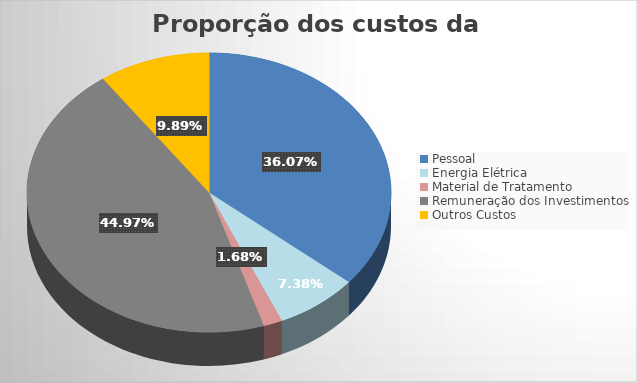
| Category | Series 0 |
|---|---|
| Pessoal | 522020295.011 |
| Energia Elétrica | 106870256.966 |
| Material de Tratamento | 24364772.167 |
| Remuneração dos Investimentos | 650878235.709 |
| Outros Custos | 143166576.619 |